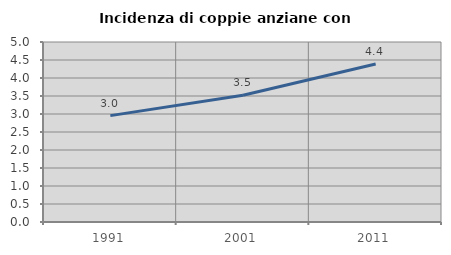
| Category | Incidenza di coppie anziane con figli |
|---|---|
| 1991.0 | 2.955 |
| 2001.0 | 3.521 |
| 2011.0 | 4.39 |